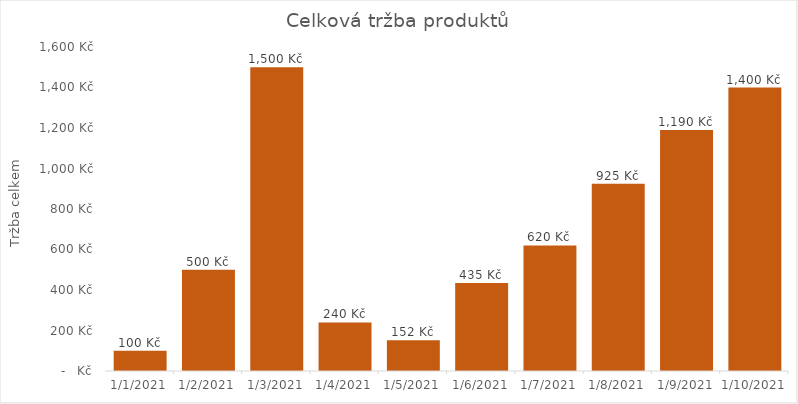
| Category | Tržba celkem |
|---|---|
| 1/3/21 | 1500 |
| 1/10/21 | 1400 |
| 1/9/21 | 1190 |
| 1/8/21 | 925 |
| 1/7/21 | 620 |
| 1/2/21 | 500 |
| 1/6/21 | 435 |
| 1/4/21 | 240 |
| 1/5/21 | 152 |
| 1/1/21 | 100 |